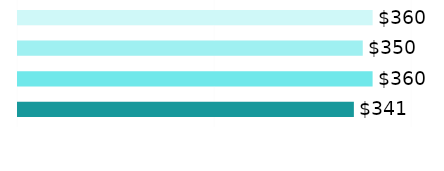
| Category | Roommate 1 | Roommate 2 | Roommate 3 | Roommate 4 |
|---|---|---|---|---|
| 0 | 360 | 350 | 360 | 341 |